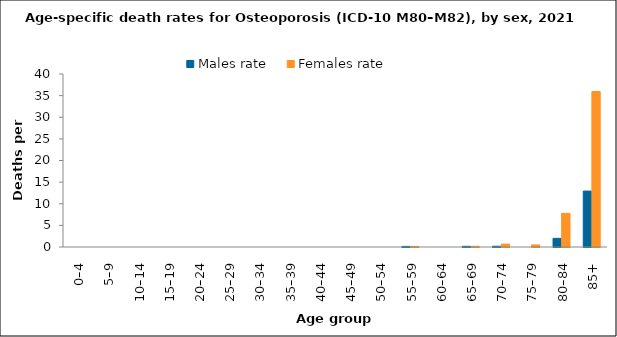
| Category | Males rate | Females rate |
|---|---|---|
| 0–4 | 0 | 0 |
| 5–9 | 0 | 0 |
| 10–14 | 0 | 0 |
| 15–19 | 0 | 0 |
| 20–24 | 0 | 0 |
| 25–29 | 0 | 0 |
| 30–34 | 0 | 0 |
| 35–39 | 0 | 0 |
| 40–44 | 0 | 0 |
| 45–49 | 0 | 0 |
| 50–54 | 0 | 0 |
| 55–59 | 0.131 | 0.127 |
| 60–64 | 0 | 0 |
| 65–69 | 0.162 | 0.151 |
| 70–74 | 0.18 | 0.676 |
| 75–79 | 0 | 0.477 |
| 80–84 | 2 | 7.785 |
| 85+ | 12.93 | 35.951 |